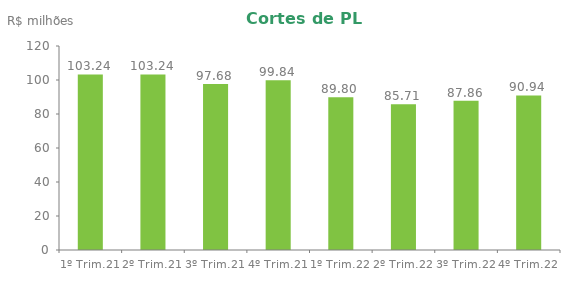
| Category | Series 0 |
|---|---|
| 1º Trim.21 | 103.241 |
| 2º Trim.21 | 103.241 |
| 3º Trim.21 | 97.678 |
| 4º Trim.21 | 99.84 |
| 1º Trim.22 | 89.798 |
| 2º Trim.22 | 85.707 |
| 3º Trim.22 | 87.86 |
| 4º Trim.22 | 90.94 |